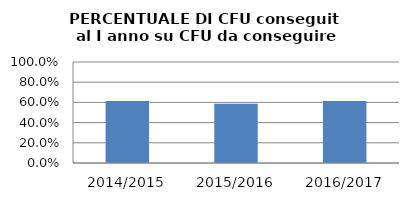
| Category | 2014/2015 2015/2016 2016/2017 |
|---|---|
| 2014/2015 | 0.614 |
| 2015/2016 | 0.587 |
| 2016/2017 | 0.615 |